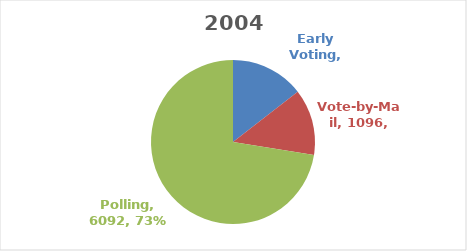
| Category | Series 0 |
|---|---|
| Early Voting | 1217 |
| Vote-by-Mail | 1096 |
| Polling | 6092 |